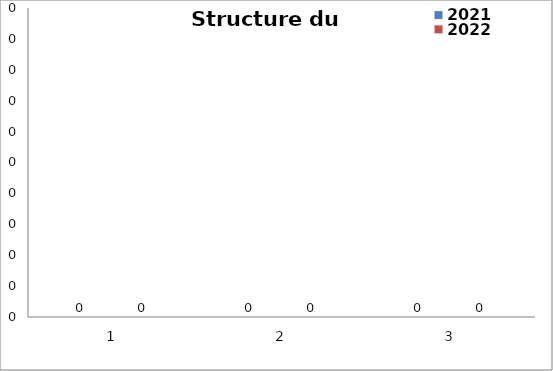
| Category | 2021 | 2022 |
|---|---|---|
| 0 | 0 | 0 |
| 1 | 0 | 0 |
| 2 | 0 | 0 |